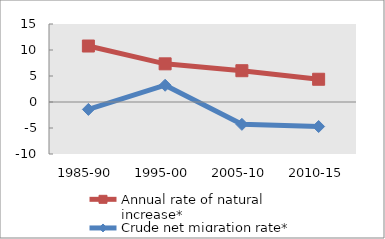
| Category | Annual rate of natural increase* | Crude net migration rate* |
|---|---|---|
| 1985-90 | 10.764 | -1.427 |
| 1995-00 | 7.338 | 3.223 |
| 2005-10 | 6.016 | -4.298 |
| 2010-15 | 4.373 | -4.716 |